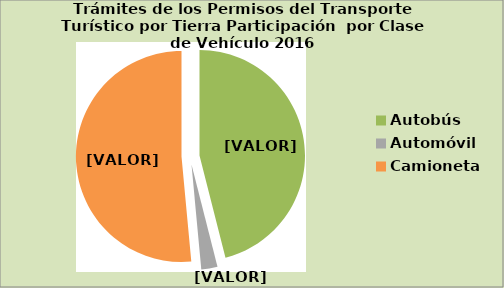
| Category | Series 0 |
|---|---|
| Autobús | 46.037 |
| Automóvil | 2.482 |
| Camioneta | 51.48 |